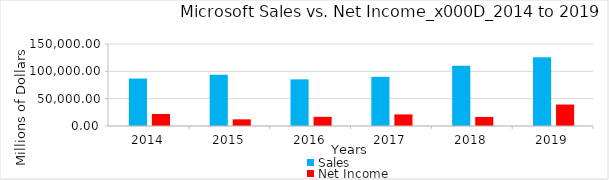
| Category | Sales | Net Income |
|---|---|---|
| 2019.0 | 125843 | 39240 |
| 2018.0 | 110360 | 16571 |
| 2017.0 | 89950 | 21204 |
| 2016.0 | 85320 | 16798 |
| 2015.0 | 93580 | 12193 |
| 2014.0 | 86833 | 22074 |